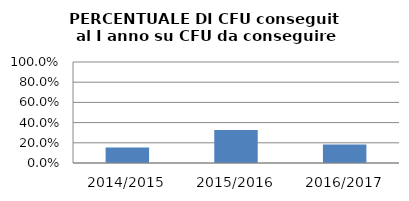
| Category | 2014/2015 2015/2016 2016/2017 |
|---|---|
| 2014/2015 | 0.154 |
| 2015/2016 | 0.328 |
| 2016/2017 | 0.183 |